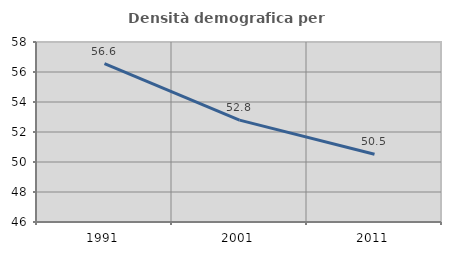
| Category | Densità demografica |
|---|---|
| 1991.0 | 56.559 |
| 2001.0 | 52.793 |
| 2011.0 | 50.52 |